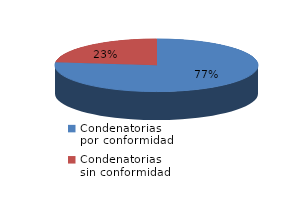
| Category | Series 0 |
|---|---|
| 0 | 3447 |
| 1 | 1036 |